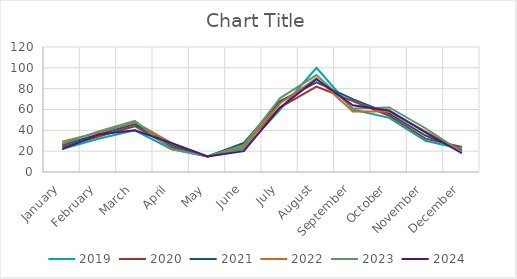
| Category | 2019 | 2020 | 2021 | 2022 | 2023 | 2024 |
|---|---|---|---|---|---|---|
| January | 22 | 24 | 26 | 29 | 27 | 22 |
| February | 32 | 34 | 36 | 38 | 39 | 36 |
| March | 40 | 44 | 46 | 48 | 49 | 40 |
| April | 22 | 24 | 26 | 28 | 22 | 28 |
| May | 15 | 15 | 15 | 15 | 15 | 15 |
| June | 22 | 26 | 28 | 24 | 26 | 20 |
| July | 60 | 62 | 68 | 66 | 71 | 62 |
| August | 100 | 82 | 86 | 90 | 93 | 89 |
| September | 60 | 68 | 70 | 58 | 61 | 64 |
| October | 52 | 54 | 56 | 58 | 62 | 59 |
| November | 30 | 32 | 35 | 39 | 42 | 38 |
| December | 22 | 24 | 21 | 20 | 19 | 18 |